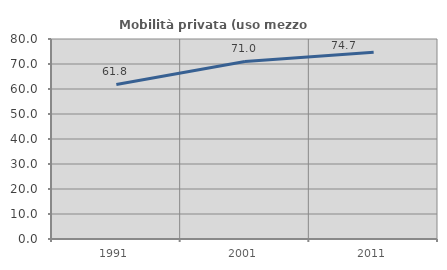
| Category | Mobilità privata (uso mezzo privato) |
|---|---|
| 1991.0 | 61.823 |
| 2001.0 | 71.039 |
| 2011.0 | 74.728 |